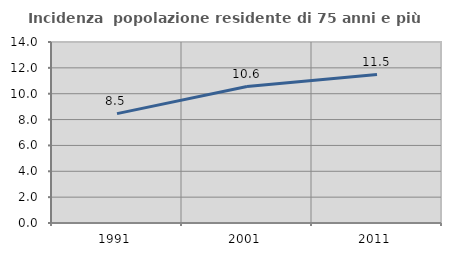
| Category | Incidenza  popolazione residente di 75 anni e più |
|---|---|
| 1991.0 | 8.46 |
| 2001.0 | 10.553 |
| 2011.0 | 11.484 |